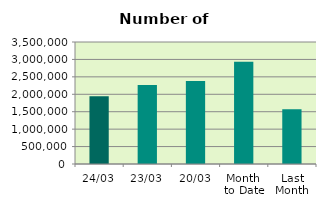
| Category | Series 0 |
|---|---|
| 24/03 | 1946452 |
| 23/03 | 2264380 |
| 20/03 | 2380548 |
| Month 
to Date | 2935125.765 |
| Last
Month | 1567888.4 |